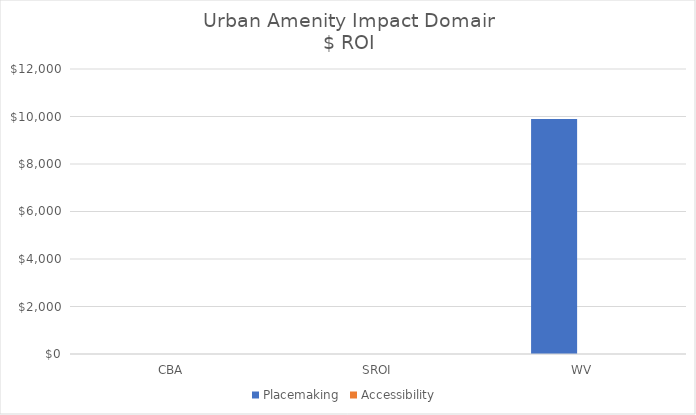
| Category | Placemaking | Accessibility  |
|---|---|---|
| CBA | 0 | 0 |
| SROI | 0 | 0 |
| WV | 9892.3 | 0 |